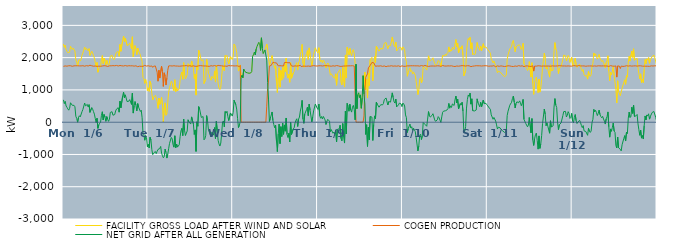
| Category | FACILITY GROSS LOAD AFTER WIND AND SOLAR | COGEN PRODUCTION | NET GRID AFTER ALL GENERATION |
|---|---|---|---|
|  Mon  1/6 | 2422 | 1730 | 692 |
|  Mon  1/6 | 2316 | 1742 | 574 |
|  Mon  1/6 | 2391 | 1743 | 648 |
|  Mon  1/6 | 2245 | 1744 | 501 |
|  Mon  1/6 | 2195 | 1736 | 459 |
|  Mon  1/6 | 2151 | 1741 | 410 |
|  Mon  1/6 | 2121 | 1749 | 372 |
|  Mon  1/6 | 2169 | 1739 | 430 |
|  Mon  1/6 | 2351 | 1749 | 602 |
|  Mon  1/6 | 2306 | 1733 | 573 |
|  Mon  1/6 | 2254 | 1732 | 522 |
|  Mon  1/6 | 2295 | 1752 | 543 |
|  Mon  1/6 | 2267 | 1746 | 521 |
|  Mon  1/6 | 2207 | 1730 | 477 |
|  Mon  1/6 | 1932 | 1748 | 184 |
|  Mon  1/6 | 1855 | 1738 | 117 |
|  Mon  1/6 | 1748 | 1748 | 0 |
|  Mon  1/6 | 1893 | 1750 | 143 |
|  Mon  1/6 | 1943 | 1744 | 199 |
|  Mon  1/6 | 1893 | 1729 | 164 |
|  Mon  1/6 | 1935 | 1744 | 191 |
|  Mon  1/6 | 2075 | 1749 | 326 |
|  Mon  1/6 | 2143 | 1750 | 393 |
|  Mon  1/6 | 2120 | 1742 | 378 |
|  Mon  1/6 | 2328 | 1735 | 593 |
|  Mon  1/6 | 2241 | 1733 | 508 |
|  Mon  1/6 | 2285 | 1752 | 533 |
|  Mon  1/6 | 2279 | 1730 | 549 |
|  Mon  1/6 | 2211 | 1741 | 470 |
|  Mon  1/6 | 2279 | 1734 | 545 |
|  Mon  1/6 | 2069 | 1765 | 304 |
|  Mon  1/6 | 2053 | 1743 | 310 |
|  Mon  1/6 | 2198 | 1748 | 450 |
|  Mon  1/6 | 2140 | 1737 | 403 |
|  Mon  1/6 | 2064 | 1735 | 329 |
|  Mon  1/6 | 1991 | 1741 | 250 |
|  Mon  1/6 | 1856 | 1740 | 116 |
|  Mon  1/6 | 1719 | 1727 | -8 |
|  Mon  1/6 | 1851 | 1730 | 121 |
|  Mon  1/6 | 1548 | 1739 | -191 |
|  Mon  1/6 | 1652 | 1736 | -84 |
|  Mon  1/6 | 1695 | 1728 | -33 |
|  Mon  1/6 | 1731 | 1732 | -1 |
|  Mon  1/6 | 1941 | 1729 | 212 |
|  Mon  1/6 | 2064 | 1741 | 323 |
|  Mon  1/6 | 1812 | 1745 | 67 |
|  Mon  1/6 | 1988 | 1750 | 238 |
|  Mon  1/6 | 1900 | 1738 | 162 |
|  Mon  1/6 | 1773 | 1746 | 27 |
|  Mon  1/6 | 1914 | 1742 | 172 |
|  Mon  1/6 | 1819 | 1726 | 93 |
|  Mon  1/6 | 1764 | 1738 | 26 |
|  Mon  1/6 | 1830 | 1746 | 84 |
|  Mon  1/6 | 2044 | 1743 | 301 |
|  Mon  1/6 | 2045 | 1747 | 298 |
|  Mon  1/6 | 2072 | 1747 | 325 |
|  Mon  1/6 | 1968 | 1752 | 216 |
|  Mon  1/6 | 1936 | 1747 | 189 |
|  Mon  1/6 | 1984 | 1748 | 236 |
|  Mon  1/6 | 2101 | 1753 | 348 |
|  Mon  1/6 | 2163 | 1758 | 405 |
|  Mon  1/6 | 2145 | 1749 | 396 |
|  Mon  1/6 | 2191 | 1741 | 450 |
|  Mon  1/6 | 2042 | 1732 | 310 |
|  Mon  1/6 | 2408 | 1757 | 651 |
|  Mon  1/6 | 2196 | 1752 | 444 |
|  Mon  1/6 | 2211 | 1747 | 464 |
|  Mon  1/6 | 2540 | 1730 | 810 |
|  Mon  1/6 | 2669 | 1741 | 928 |
|  Mon  1/6 | 2499 | 1744 | 755 |
|  Mon  1/6 | 2602 | 1755 | 847 |
|  Mon  1/6 | 2608 | 1742 | 866 |
|  Mon  1/6 | 2378 | 1739 | 639 |
|  Mon  1/6 | 2396 | 1747 | 649 |
|  Mon  1/6 | 2401 | 1750 | 651 |
|  Mon  1/6 | 2456 | 1756 | 700 |
|  Mon  1/6 | 2370 | 1746 | 624 |
|  Mon  1/6 | 2275 | 1725 | 550 |
|  Mon  1/6 | 2646 | 1747 | 899 |
|  Mon  1/6 | 2026 | 1744 | 282 |
|  Mon  1/6 | 2253 | 1737 | 516 |
|  Mon  1/6 | 2374 | 1735 | 639 |
|  Mon  1/6 | 2271 | 1747 | 524 |
|  Mon  1/6 | 2091 | 1741 | 350 |
|  Mon  1/6 | 2296 | 1720 | 576 |
|  Mon  1/6 | 2212 | 1746 | 466 |
|  Mon  1/6 | 2200 | 1735 | 465 |
|  Mon  1/6 | 2080 | 1748 | 332 |
|  Mon  1/6 | 2102 | 1731 | 371 |
|  Mon  1/6 | 1881 | 1742 | 139 |
|  Mon  1/6 | 1385 | 1730 | -345 |
|  Mon  1/6 | 1344 | 1733 | -389 |
|  Mon  1/6 | 1202 | 1761 | -559 |
|  Mon  1/6 | 1326 | 1740 | -414 |
|  Mon  1/6 | 1258 | 1738 | -480 |
|  Mon  1/6 | 975 | 1741 | -766 |
|  Tue  1/7 | 1065 | 1749 | -684 |
|  Tue  1/7 | 954 | 1753 | -799 |
|  Tue  1/7 | 1264 | 1732 | -468 |
|  Tue  1/7 | 1179 | 1730 | -551 |
|  Tue  1/7 | 890 | 1742 | -852 |
|  Tue  1/7 | 693 | 1698 | -1005 |
|  Tue  1/7 | 778 | 1734 | -956 |
|  Tue  1/7 | 778 | 1743 | -965 |
|  Tue  1/7 | 834 | 1742 | -908 |
|  Tue  1/7 | 741 | 1715 | -974 |
|  Tue  1/7 | 649 | 1549 | -900 |
|  Tue  1/7 | 427 | 1270 | -843 |
|  Tue  1/7 | 747 | 1609 | -862 |
|  Tue  1/7 | 551 | 1367 | -816 |
|  Tue  1/7 | 642 | 1394 | -752 |
|  Tue  1/7 | 772 | 1733 | -961 |
|  Tue  1/7 | 536 | 1570 | -1034 |
|  Tue  1/7 | 6 | 1109 | -1103 |
|  Tue  1/7 | 462 | 1530 | -1068 |
|  Tue  1/7 | 599 | 1434 | -835 |
|  Tue  1/7 | 213 | 1151 | -938 |
|  Tue  1/7 | 253 | 1365 | -1112 |
|  Tue  1/7 | 613 | 1607 | -994 |
|  Tue  1/7 | 920 | 1743 | -823 |
|  Tue  1/7 | 1075 | 1735 | -660 |
|  Tue  1/7 | 1096 | 1747 | -651 |
|  Tue  1/7 | 1268 | 1741 | -473 |
|  Tue  1/7 | 1223 | 1740 | -517 |
|  Tue  1/7 | 1045 | 1741 | -696 |
|  Tue  1/7 | 975 | 1749 | -774 |
|  Tue  1/7 | 1315 | 1736 | -421 |
|  Tue  1/7 | 946 | 1740 | -794 |
|  Tue  1/7 | 1066 | 1743 | -677 |
|  Tue  1/7 | 967 | 1739 | -772 |
|  Tue  1/7 | 997 | 1745 | -748 |
|  Tue  1/7 | 1035 | 1734 | -699 |
|  Tue  1/7 | 1299 | 1744 | -445 |
|  Tue  1/7 | 1476 | 1739 | -263 |
|  Tue  1/7 | 1554 | 1745 | -191 |
|  Tue  1/7 | 1330 | 1745 | -415 |
|  Tue  1/7 | 1844 | 1749 | 95 |
|  Tue  1/7 | 1493 | 1748 | -255 |
|  Tue  1/7 | 1341 | 1755 | -414 |
|  Tue  1/7 | 1319 | 1754 | -435 |
|  Tue  1/7 | 1468 | 1741 | -273 |
|  Tue  1/7 | 1812 | 1738 | 74 |
|  Tue  1/7 | 1752 | 1746 | 6 |
|  Tue  1/7 | 1784 | 1751 | 33 |
|  Tue  1/7 | 1705 | 1763 | -58 |
|  Tue  1/7 | 1898 | 1734 | 164 |
|  Tue  1/7 | 1892 | 1748 | 144 |
|  Tue  1/7 | 1691 | 1747 | -56 |
|  Tue  1/7 | 1353 | 1733 | -380 |
|  Tue  1/7 | 1494 | 1733 | -239 |
|  Tue  1/7 | 838 | 1744 | -906 |
|  Tue  1/7 | 1744 | 1732 | 12 |
|  Tue  1/7 | 1622 | 1748 | -126 |
|  Tue  1/7 | 2229 | 1747 | 482 |
|  Tue  1/7 | 2156 | 1744 | 412 |
|  Tue  1/7 | 2160 | 1753 | 407 |
|  Tue  1/7 | 1899 | 1752 | 147 |
|  Tue  1/7 | 1901 | 1746 | 155 |
|  Tue  1/7 | 1934 | 1760 | 174 |
|  Tue  1/7 | 1196 | 1742 | -546 |
|  Tue  1/7 | 1223 | 1736 | -513 |
|  Tue  1/7 | 1335 | 1742 | -407 |
|  Tue  1/7 | 1952 | 1748 | 204 |
|  Tue  1/7 | 1782 | 1735 | 47 |
|  Tue  1/7 | 1511 | 1740 | -229 |
|  Tue  1/7 | 1473 | 1730 | -257 |
|  Tue  1/7 | 1347 | 1733 | -386 |
|  Tue  1/7 | 1299 | 1750 | -451 |
|  Tue  1/7 | 1419 | 1721 | -302 |
|  Tue  1/7 | 1421 | 1739 | -318 |
|  Tue  1/7 | 1348 | 1750 | -402 |
|  Tue  1/7 | 1589 | 1755 | -166 |
|  Tue  1/7 | 1243 | 1749 | -506 |
|  Tue  1/7 | 1767 | 1735 | 32 |
|  Tue  1/7 | 1474 | 1737 | -263 |
|  Tue  1/7 | 1195 | 1759 | -564 |
|  Tue  1/7 | 1062 | 1735 | -673 |
|  Tue  1/7 | 1012 | 1751 | -739 |
|  Tue  1/7 | 1077 | 1723 | -646 |
|  Tue  1/7 | 1398 | 1746 | -348 |
|  Tue  1/7 | 1746 | 1740 | 6 |
|  Tue  1/7 | 1776 | 1737 | 39 |
|  Tue  1/7 | 1597 | 1743 | -146 |
|  Tue  1/7 | 2070 | 1738 | 332 |
|  Tue  1/7 | 2039 | 1756 | 283 |
|  Tue  1/7 | 2070 | 1732 | 338 |
|  Tue  1/7 | 1904 | 1729 | 175 |
|  Tue  1/7 | 1805 | 1755 | 50 |
|  Tue  1/7 | 1815 | 1744 | 71 |
|  Tue  1/7 | 2032 | 1747 | 285 |
|  Tue  1/7 | 2045 | 1758 | 287 |
|  Tue  1/7 | 1939 | 1750 | 189 |
|  Wed  1/8 | 2037 | 1737 | 300 |
|  Wed  1/8 | 2422 | 1742 | 680 |
|  Wed  1/8 | 2386 | 1726 | 660 |
|  Wed  1/8 | 2285 | 1745 | 540 |
|  Wed  1/8 | 2163 | 1757 | 406 |
|  Wed  1/8 | 1863 | 1745 | 118 |
|  Wed  1/8 | 1583 | 1748 | -165 |
|  Wed  1/8 | 1627 | 1722 | -95 |
|  Wed  1/8 | 1774 | 1758 | 16 |
|  Wed  1/8 | 1376 | 0 | 1376 |
|  Wed  1/8 | 1460 | 0 | 1460 |
|  Wed  1/8 | 1374 | 0 | 1374 |
|  Wed  1/8 | 1642 | 0 | 1642 |
|  Wed  1/8 | 1593 | 0 | 1593 |
|  Wed  1/8 | 1547 | 0 | 1547 |
|  Wed  1/8 | 1568 | 0 | 1568 |
|  Wed  1/8 | 1530 | 0 | 1530 |
|  Wed  1/8 | 1503 | 0 | 1503 |
|  Wed  1/8 | 1516 | 0 | 1516 |
|  Wed  1/8 | 1514 | 0 | 1514 |
|  Wed  1/8 | 1528 | 0 | 1528 |
|  Wed  1/8 | 1568 | 0 | 1568 |
|  Wed  1/8 | 2044 | 0 | 2044 |
|  Wed  1/8 | 2086 | 0 | 2086 |
|  Wed  1/8 | 2172 | 0 | 2172 |
|  Wed  1/8 | 2085 | 0 | 2085 |
|  Wed  1/8 | 2263 | 0 | 2263 |
|  Wed  1/8 | 2348 | 0 | 2348 |
|  Wed  1/8 | 2353 | 0 | 2353 |
|  Wed  1/8 | 2473 | 0 | 2473 |
|  Wed  1/8 | 2439 | 0 | 2439 |
|  Wed  1/8 | 2226 | 0 | 2226 |
|  Wed  1/8 | 2614 | 0 | 2614 |
|  Wed  1/8 | 2289 | 0 | 2289 |
|  Wed  1/8 | 2127 | 0 | 2127 |
|  Wed  1/8 | 2107 | 0 | 2107 |
|  Wed  1/8 | 2240 | 0 | 2240 |
|  Wed  1/8 | 2237 | 0 | 2237 |
|  Wed  1/8 | 2420 | 496 | 1924 |
|  Wed  1/8 | 2266 | 1035 | 1231 |
|  Wed  1/8 | 1995 | 1279 | 716 |
|  Wed  1/8 | 1761 | 1740 | 21 |
|  Wed  1/8 | 1867 | 1750 | 117 |
|  Wed  1/8 | 1866 | 1757 | 109 |
|  Wed  1/8 | 2063 | 1747 | 316 |
|  Wed  1/8 | 1907 | 1857 | 50 |
|  Wed  1/8 | 1768 | 1844 | -76 |
|  Wed  1/8 | 1668 | 1841 | -173 |
|  Wed  1/8 | 1752 | 1842 | -90 |
|  Wed  1/8 | 1254 | 1836 | -582 |
|  Wed  1/8 | 922 | 1834 | -912 |
|  Wed  1/8 | 1380 | 1746 | -366 |
|  Wed  1/8 | 1689 | 1749 | -60 |
|  Wed  1/8 | 1085 | 1750 | -665 |
|  Wed  1/8 | 1603 | 1742 | -139 |
|  Wed  1/8 | 1301 | 1745 | -444 |
|  Wed  1/8 | 1702 | 1732 | -30 |
|  Wed  1/8 | 1364 | 1741 | -377 |
|  Wed  1/8 | 1764 | 1849 | -85 |
|  Wed  1/8 | 1568 | 1847 | -279 |
|  Wed  1/8 | 1983 | 1853 | 130 |
|  Wed  1/8 | 1461 | 1841 | -380 |
|  Wed  1/8 | 1367 | 1839 | -472 |
|  Wed  1/8 | 1491 | 1836 | -345 |
|  Wed  1/8 | 1237 | 1847 | -610 |
|  Wed  1/8 | 1844 | 1849 | -5 |
|  Wed  1/8 | 1360 | 1741 | -381 |
|  Wed  1/8 | 1377 | 1749 | -372 |
|  Wed  1/8 | 1526 | 1735 | -209 |
|  Wed  1/8 | 1570 | 1745 | -175 |
|  Wed  1/8 | 1717 | 1744 | -27 |
|  Wed  1/8 | 1791 | 1732 | 59 |
|  Wed  1/8 | 1845 | 1739 | 106 |
|  Wed  1/8 | 1614 | 1748 | -134 |
|  Wed  1/8 | 1841 | 1747 | 94 |
|  Wed  1/8 | 1902 | 1743 | 159 |
|  Wed  1/8 | 2105 | 1760 | 345 |
|  Wed  1/8 | 2190 | 1724 | 466 |
|  Wed  1/8 | 2409 | 1733 | 676 |
|  Wed  1/8 | 1834 | 1737 | 97 |
|  Wed  1/8 | 1700 | 1736 | -36 |
|  Wed  1/8 | 1987 | 1736 | 251 |
|  Wed  1/8 | 1979 | 1724 | 255 |
|  Wed  1/8 | 2123 | 1733 | 390 |
|  Wed  1/8 | 2219 | 1756 | 463 |
|  Wed  1/8 | 1942 | 1740 | 202 |
|  Wed  1/8 | 2302 | 1743 | 559 |
|  Wed  1/8 | 2103 | 1731 | 372 |
|  Wed  1/8 | 2107 | 1736 | 371 |
|  Wed  1/8 | 1751 | 1742 | 9 |
|  Wed  1/8 | 1904 | 1741 | 163 |
|  Wed  1/8 | 2102 | 1753 | 349 |
|  Wed  1/8 | 2073 | 1740 | 333 |
|  Wed  1/8 | 2306 | 1744 | 562 |
|  Wed  1/8 | 2287 | 1742 | 545 |
|  Wed  1/8 | 2175 | 1739 | 436 |
|  Thu  1/9 | 2143 | 1749 | 394 |
|  Thu  1/9 | 2309 | 1748 | 561 |
|  Thu  1/9 | 1946 | 1752 | 194 |
|  Thu  1/9 | 1870 | 1749 | 121 |
|  Thu  1/9 | 1925 | 1749 | 176 |
|  Thu  1/9 | 1839 | 1741 | 98 |
|  Thu  1/9 | 1927 | 1749 | 178 |
|  Thu  1/9 | 1876 | 1750 | 126 |
|  Thu  1/9 | 1808 | 1739 | 69 |
|  Thu  1/9 | 1680 | 1751 | -71 |
|  Thu  1/9 | 1783 | 1758 | 25 |
|  Thu  1/9 | 1834 | 1746 | 88 |
|  Thu  1/9 | 1799 | 1733 | 66 |
|  Thu  1/9 | 1772 | 1741 | 31 |
|  Thu  1/9 | 1457 | 1750 | -293 |
|  Thu  1/9 | 1501 | 1734 | -233 |
|  Thu  1/9 | 1505 | 1744 | -239 |
|  Thu  1/9 | 1404 | 1747 | -343 |
|  Thu  1/9 | 1422 | 1728 | -306 |
|  Thu  1/9 | 1364 | 1737 | -373 |
|  Thu  1/9 | 1497 | 1738 | -241 |
|  Thu  1/9 | 1145 | 1754 | -609 |
|  Thu  1/9 | 1508 | 1729 | -221 |
|  Thu  1/9 | 1553 | 1745 | -192 |
|  Thu  1/9 | 1534 | 1742 | -208 |
|  Thu  1/9 | 1635 | 1729 | -94 |
|  Thu  1/9 | 1236 | 1741 | -505 |
|  Thu  1/9 | 1154 | 1731 | -577 |
|  Thu  1/9 | 1699 | 1741 | -42 |
|  Thu  1/9 | 1282 | 1740 | -458 |
|  Thu  1/9 | 1088 | 1735 | -647 |
|  Thu  1/9 | 2084 | 1741 | 343 |
|  Thu  1/9 | 1373 | 1739 | -366 |
|  Thu  1/9 | 2325 | 1744 | 581 |
|  Thu  1/9 | 2228 | 1741 | 487 |
|  Thu  1/9 | 2085 | 1746 | 339 |
|  Thu  1/9 | 2291 | 1735 | 556 |
|  Thu  1/9 | 2125 | 1746 | 379 |
|  Thu  1/9 | 2063 | 1751 | 312 |
|  Thu  1/9 | 2215 | 1750 | 465 |
|  Thu  1/9 | 2249 | 1728 | 521 |
|  Thu  1/9 | 2128 | 1739 | 389 |
|  Thu  1/9 | 1821 | 1749 | 72 |
|  Thu  1/9 | 1796 | 0 | 1796 |
|  Thu  1/9 | 418 | 0 | 418 |
|  Thu  1/9 | 846 | 0 | 846 |
|  Thu  1/9 | 911 | 0 | 911 |
|  Thu  1/9 | 764 | 0 | 764 |
|  Thu  1/9 | 845 | 0 | 845 |
|  Thu  1/9 | 431 | 0 | 431 |
|  Thu  1/9 | 746 | 0 | 746 |
|  Thu  1/9 | 1441 | 0 | 1441 |
|  Thu  1/9 | 1064 | 194 | 870 |
|  Thu  1/9 | 1550 | 987 | 563 |
|  Thu  1/9 | 1012 | 1393 | -381 |
|  Thu  1/9 | 1325 | 1403 | -78 |
|  Thu  1/9 | 748 | 1499 | -751 |
|  Thu  1/9 | 1525 | 1684 | -159 |
|  Thu  1/9 | 1134 | 1684 | -550 |
|  Thu  1/9 | 1935 | 1758 | 177 |
|  Thu  1/9 | 1919 | 1732 | 187 |
|  Thu  1/9 | 2009 | 1851 | 158 |
|  Thu  1/9 | 1283 | 1850 | -567 |
|  Thu  1/9 | 1773 | 1841 | -68 |
|  Thu  1/9 | 2032 | 1837 | 195 |
|  Thu  1/9 | 1840 | 1732 | 108 |
|  Thu  1/9 | 2355 | 1737 | 618 |
|  Thu  1/9 | 2299 | 1741 | 558 |
|  Thu  1/9 | 2278 | 1743 | 535 |
|  Thu  1/9 | 2202 | 1738 | 464 |
|  Thu  1/9 | 2239 | 1746 | 493 |
|  Thu  1/9 | 2290 | 1747 | 543 |
|  Thu  1/9 | 2277 | 1739 | 538 |
|  Thu  1/9 | 2265 | 1729 | 536 |
|  Thu  1/9 | 2328 | 1749 | 579 |
|  Thu  1/9 | 2443 | 1743 | 700 |
|  Thu  1/9 | 2457 | 1740 | 717 |
|  Thu  1/9 | 2470 | 1720 | 750 |
|  Thu  1/9 | 2485 | 1739 | 746 |
|  Thu  1/9 | 2272 | 1739 | 533 |
|  Thu  1/9 | 2368 | 1730 | 638 |
|  Thu  1/9 | 2366 | 1737 | 629 |
|  Thu  1/9 | 2368 | 1747 | 621 |
|  Thu  1/9 | 2349 | 1749 | 600 |
|  Thu  1/9 | 2640 | 1731 | 909 |
|  Thu  1/9 | 2500 | 1735 | 765 |
|  Thu  1/9 | 2383 | 1747 | 636 |
|  Thu  1/9 | 2335 | 1742 | 593 |
|  Thu  1/9 | 2483 | 1765 | 718 |
|  Thu  1/9 | 2211 | 1734 | 477 |
|  Thu  1/9 | 2247 | 1740 | 507 |
|  Thu  1/9 | 2283 | 1747 | 536 |
|  Thu  1/9 | 2323 | 1733 | 590 |
|  Thu  1/9 | 2316 | 1723 | 593 |
|  Thu  1/9 | 2309 | 1744 | 565 |
|  Thu  1/9 | 2228 | 1747 | 481 |
|  Fri  1/10 | 2334 | 1742 | 592 |
|  Fri  1/10 | 2291 | 1730 | 561 |
|  Fri  1/10 | 2239 | 1738 | 501 |
|  Fri  1/10 | 1957 | 1733 | 224 |
|  Fri  1/10 | 1884 | 1743 | 141 |
|  Fri  1/10 | 1424 | 1745 | -321 |
|  Fri  1/10 | 1537 | 1739 | -202 |
|  Fri  1/10 | 1530 | 1744 | -214 |
|  Fri  1/10 | 1685 | 1742 | -57 |
|  Fri  1/10 | 1567 | 1748 | -181 |
|  Fri  1/10 | 1600 | 1741 | -141 |
|  Fri  1/10 | 1491 | 1748 | -257 |
|  Fri  1/10 | 1557 | 1742 | -185 |
|  Fri  1/10 | 1544 | 1747 | -203 |
|  Fri  1/10 | 1453 | 1741 | -288 |
|  Fri  1/10 | 1274 | 1745 | -471 |
|  Fri  1/10 | 1273 | 1732 | -459 |
|  Fri  1/10 | 857 | 1746 | -889 |
|  Fri  1/10 | 999 | 1740 | -741 |
|  Fri  1/10 | 1330 | 1737 | -407 |
|  Fri  1/10 | 1379 | 1750 | -371 |
|  Fri  1/10 | 1216 | 1755 | -539 |
|  Fri  1/10 | 1317 | 1731 | -414 |
|  Fri  1/10 | 1729 | 1739 | -10 |
|  Fri  1/10 | 1732 | 1727 | 5 |
|  Fri  1/10 | 1690 | 1758 | -68 |
|  Fri  1/10 | 1714 | 1752 | -38 |
|  Fri  1/10 | 1613 | 1740 | -127 |
|  Fri  1/10 | 1849 | 1752 | 97 |
|  Fri  1/10 | 2056 | 1728 | 328 |
|  Fri  1/10 | 1928 | 1732 | 196 |
|  Fri  1/10 | 1897 | 1738 | 159 |
|  Fri  1/10 | 1902 | 1747 | 155 |
|  Fri  1/10 | 1952 | 1741 | 211 |
|  Fri  1/10 | 1995 | 1733 | 262 |
|  Fri  1/10 | 1973 | 1739 | 234 |
|  Fri  1/10 | 1816 | 1746 | 70 |
|  Fri  1/10 | 1766 | 1739 | 27 |
|  Fri  1/10 | 1744 | 1734 | 10 |
|  Fri  1/10 | 1821 | 1747 | 74 |
|  Fri  1/10 | 1911 | 1739 | 172 |
|  Fri  1/10 | 1879 | 1744 | 135 |
|  Fri  1/10 | 1842 | 1735 | 107 |
|  Fri  1/10 | 1720 | 1728 | -8 |
|  Fri  1/10 | 1902 | 1738 | 164 |
|  Fri  1/10 | 2065 | 1757 | 308 |
|  Fri  1/10 | 2082 | 1740 | 342 |
|  Fri  1/10 | 2053 | 1741 | 312 |
|  Fri  1/10 | 2101 | 1749 | 352 |
|  Fri  1/10 | 2065 | 1738 | 327 |
|  Fri  1/10 | 2128 | 1747 | 381 |
|  Fri  1/10 | 2160 | 1745 | 415 |
|  Fri  1/10 | 2332 | 1752 | 580 |
|  Fri  1/10 | 2176 | 1742 | 434 |
|  Fri  1/10 | 2250 | 1743 | 507 |
|  Fri  1/10 | 2204 | 1747 | 457 |
|  Fri  1/10 | 2318 | 1753 | 565 |
|  Fri  1/10 | 2293 | 1732 | 561 |
|  Fri  1/10 | 2257 | 1740 | 517 |
|  Fri  1/10 | 2421 | 1725 | 696 |
|  Fri  1/10 | 2561 | 1752 | 809 |
|  Fri  1/10 | 2336 | 1741 | 595 |
|  Fri  1/10 | 2443 | 1730 | 713 |
|  Fri  1/10 | 2145 | 1735 | 410 |
|  Fri  1/10 | 2138 | 1753 | 385 |
|  Fri  1/10 | 2320 | 1744 | 576 |
|  Fri  1/10 | 2272 | 1738 | 534 |
|  Fri  1/10 | 2370 | 1752 | 618 |
|  Fri  1/10 | 2081 | 1739 | 342 |
|  Fri  1/10 | 1433 | 1748 | -315 |
|  Fri  1/10 | 1449 | 1731 | -282 |
|  Fri  1/10 | 1602 | 1740 | -138 |
|  Fri  1/10 | 2184 | 1747 | 437 |
|  Fri  1/10 | 2457 | 1750 | 707 |
|  Fri  1/10 | 2595 | 1751 | 844 |
|  Fri  1/10 | 2546 | 1747 | 799 |
|  Fri  1/10 | 2632 | 1732 | 900 |
|  Fri  1/10 | 2280 | 1721 | 559 |
|  Fri  1/10 | 2461 | 1736 | 725 |
|  Fri  1/10 | 2092 | 1735 | 357 |
|  Fri  1/10 | 2125 | 1746 | 379 |
|  Fri  1/10 | 2090 | 1742 | 348 |
|  Fri  1/10 | 2122 | 1751 | 371 |
|  Fri  1/10 | 2128 | 1750 | 378 |
|  Fri  1/10 | 2469 | 1745 | 724 |
|  Fri  1/10 | 2348 | 1747 | 601 |
|  Fri  1/10 | 2318 | 1743 | 575 |
|  Fri  1/10 | 2223 | 1747 | 476 |
|  Fri  1/10 | 2356 | 1739 | 617 |
|  Fri  1/10 | 2212 | 1740 | 472 |
|  Fri  1/10 | 2228 | 1741 | 487 |
|  Fri  1/10 | 2431 | 1746 | 685 |
|  Fri  1/10 | 2313 | 1738 | 575 |
|  Fri  1/10 | 2307 | 1750 | 557 |
|  Fri  1/10 | 2330 | 1746 | 584 |
|  Fri  1/10 | 2289 | 1747 | 542 |
|  Sat  1/11 | 2249 | 1743 | 506 |
|  Sat  1/11 | 2240 | 1734 | 506 |
|  Sat  1/11 | 2176 | 1745 | 431 |
|  Sat  1/11 | 2138 | 1739 | 399 |
|  Sat  1/11 | 1963 | 1735 | 228 |
|  Sat  1/11 | 1992 | 1739 | 253 |
|  Sat  1/11 | 1839 | 1748 | 91 |
|  Sat  1/11 | 1898 | 1751 | 147 |
|  Sat  1/11 | 1869 | 1747 | 122 |
|  Sat  1/11 | 1753 | 1719 | 34 |
|  Sat  1/11 | 1657 | 1741 | -84 |
|  Sat  1/11 | 1532 | 1745 | -213 |
|  Sat  1/11 | 1576 | 1731 | -155 |
|  Sat  1/11 | 1550 | 1731 | -181 |
|  Sat  1/11 | 1557 | 1733 | -176 |
|  Sat  1/11 | 1526 | 1745 | -219 |
|  Sat  1/11 | 1518 | 1758 | -240 |
|  Sat  1/11 | 1464 | 1735 | -271 |
|  Sat  1/11 | 1467 | 1752 | -285 |
|  Sat  1/11 | 1408 | 1725 | -317 |
|  Sat  1/11 | 1395 | 1728 | -333 |
|  Sat  1/11 | 1455 | 1734 | -279 |
|  Sat  1/11 | 1948 | 1742 | 206 |
|  Sat  1/11 | 2089 | 1748 | 341 |
|  Sat  1/11 | 2099 | 1736 | 363 |
|  Sat  1/11 | 2271 | 1743 | 528 |
|  Sat  1/11 | 2275 | 1729 | 546 |
|  Sat  1/11 | 2348 | 1730 | 618 |
|  Sat  1/11 | 2488 | 1751 | 737 |
|  Sat  1/11 | 2535 | 1724 | 811 |
|  Sat  1/11 | 2363 | 1744 | 619 |
|  Sat  1/11 | 2181 | 1741 | 440 |
|  Sat  1/11 | 2332 | 1752 | 580 |
|  Sat  1/11 | 2362 | 1730 | 632 |
|  Sat  1/11 | 2381 | 1742 | 639 |
|  Sat  1/11 | 2353 | 1752 | 601 |
|  Sat  1/11 | 2394 | 1734 | 660 |
|  Sat  1/11 | 2344 | 1738 | 606 |
|  Sat  1/11 | 2252 | 1742 | 510 |
|  Sat  1/11 | 2329 | 1746 | 583 |
|  Sat  1/11 | 2443 | 1737 | 706 |
|  Sat  1/11 | 1810 | 1722 | 88 |
|  Sat  1/11 | 1817 | 1742 | 75 |
|  Sat  1/11 | 1702 | 1742 | -40 |
|  Sat  1/11 | 1670 | 1737 | -67 |
|  Sat  1/11 | 1599 | 1743 | -144 |
|  Sat  1/11 | 1648 | 1737 | -89 |
|  Sat  1/11 | 1876 | 1731 | 145 |
|  Sat  1/11 | 1873 | 1755 | 118 |
|  Sat  1/11 | 1398 | 1727 | -329 |
|  Sat  1/11 | 1843 | 1731 | 112 |
|  Sat  1/11 | 1200 | 1748 | -548 |
|  Sat  1/11 | 862 | 1583 | -721 |
|  Sat  1/11 | 1222 | 1739 | -517 |
|  Sat  1/11 | 1356 | 1743 | -387 |
|  Sat  1/11 | 1399 | 1736 | -337 |
|  Sat  1/11 | 1168 | 1737 | -569 |
|  Sat  1/11 | 913 | 1748 | -835 |
|  Sat  1/11 | 1333 | 1758 | -425 |
|  Sat  1/11 | 932 | 1744 | -812 |
|  Sat  1/11 | 1061 | 1738 | -677 |
|  Sat  1/11 | 1320 | 1736 | -416 |
|  Sat  1/11 | 1712 | 1758 | -46 |
|  Sat  1/11 | 1691 | 1741 | -50 |
|  Sat  1/11 | 2142 | 1734 | 408 |
|  Sat  1/11 | 1988 | 1738 | 250 |
|  Sat  1/11 | 1652 | 1761 | -109 |
|  Sat  1/11 | 1719 | 1739 | -20 |
|  Sat  1/11 | 1628 | 1753 | -125 |
|  Sat  1/11 | 1618 | 1739 | -121 |
|  Sat  1/11 | 1396 | 1738 | -342 |
|  Sat  1/11 | 1777 | 1733 | 44 |
|  Sat  1/11 | 1591 | 1741 | -150 |
|  Sat  1/11 | 1565 | 1745 | -180 |
|  Sat  1/11 | 1613 | 1724 | -111 |
|  Sat  1/11 | 2209 | 1740 | 469 |
|  Sat  1/11 | 2466 | 1735 | 731 |
|  Sat  1/11 | 2269 | 1740 | 529 |
|  Sat  1/11 | 2204 | 1747 | 457 |
|  Sat  1/11 | 1748 | 1743 | 5 |
|  Sat  1/11 | 1505 | 1736 | -231 |
|  Sat  1/11 | 1671 | 1752 | -81 |
|  Sat  1/11 | 1673 | 1756 | -83 |
|  Sat  1/11 | 1724 | 1745 | -21 |
|  Sat  1/11 | 1718 | 1744 | -26 |
|  Sat  1/11 | 1945 | 1741 | 204 |
|  Sat  1/11 | 2081 | 1752 | 329 |
|  Sat  1/11 | 2094 | 1742 | 352 |
|  Sat  1/11 | 2055 | 1721 | 334 |
|  Sat  1/11 | 1899 | 1738 | 161 |
|  Sat  1/11 | 1967 | 1753 | 214 |
|  Sat  1/11 | 2070 | 1744 | 326 |
|  Sat  1/11 | 2010 | 1740 | 270 |
|  Sat  1/11 | 1854 | 1738 | 116 |
|  Sat  1/11 | 1879 | 1731 | 148 |
|  Sat  1/11 | 2008 | 1736 | 272 |
|  Sun  1/12 | 1773 | 1733 | 40 |
|  Sun  1/12 | 1731 | 1752 | -21 |
|  Sun  1/12 | 1893 | 1742 | 151 |
|  Sun  1/12 | 1983 | 1747 | 236 |
|  Sun  1/12 | 1774 | 1728 | 46 |
|  Sun  1/12 | 1698 | 1739 | -41 |
|  Sun  1/12 | 1737 | 1730 | 7 |
|  Sun  1/12 | 1755 | 1754 | 1 |
|  Sun  1/12 | 1800 | 1745 | 55 |
|  Sun  1/12 | 1728 | 1742 | -14 |
|  Sun  1/12 | 1638 | 1742 | -104 |
|  Sun  1/12 | 1574 | 1743 | -169 |
|  Sun  1/12 | 1638 | 1742 | -104 |
|  Sun  1/12 | 1474 | 1743 | -269 |
|  Sun  1/12 | 1436 | 1727 | -291 |
|  Sun  1/12 | 1445 | 1733 | -288 |
|  Sun  1/12 | 1437 | 1734 | -297 |
|  Sun  1/12 | 1334 | 1741 | -407 |
|  Sun  1/12 | 1571 | 1761 | -190 |
|  Sun  1/12 | 1461 | 1742 | -281 |
|  Sun  1/12 | 1422 | 1739 | -317 |
|  Sun  1/12 | 1471 | 1743 | -272 |
|  Sun  1/12 | 1739 | 1747 | -8 |
|  Sun  1/12 | 1825 | 1737 | 88 |
|  Sun  1/12 | 2145 | 1749 | 396 |
|  Sun  1/12 | 2066 | 1743 | 323 |
|  Sun  1/12 | 2118 | 1751 | 367 |
|  Sun  1/12 | 2034 | 1736 | 298 |
|  Sun  1/12 | 1954 | 1750 | 204 |
|  Sun  1/12 | 2017 | 1747 | 270 |
|  Sun  1/12 | 2100 | 1727 | 373 |
|  Sun  1/12 | 1980 | 1744 | 236 |
|  Sun  1/12 | 1920 | 1747 | 173 |
|  Sun  1/12 | 1878 | 1742 | 136 |
|  Sun  1/12 | 1917 | 1737 | 180 |
|  Sun  1/12 | 1842 | 1744 | 98 |
|  Sun  1/12 | 1770 | 1738 | 32 |
|  Sun  1/12 | 1684 | 1742 | -58 |
|  Sun  1/12 | 1845 | 1742 | 103 |
|  Sun  1/12 | 1914 | 1741 | 173 |
|  Sun  1/12 | 2058 | 1740 | 318 |
|  Sun  1/12 | 1585 | 1728 | -143 |
|  Sun  1/12 | 1284 | 1748 | -464 |
|  Sun  1/12 | 1543 | 1752 | -209 |
|  Sun  1/12 | 1466 | 1749 | -283 |
|  Sun  1/12 | 1578 | 1738 | -160 |
|  Sun  1/12 | 1720 | 1747 | -27 |
|  Sun  1/12 | 1458 | 1734 | -276 |
|  Sun  1/12 | 1432 | 1749 | -317 |
|  Sun  1/12 | 1015 | 1742 | -727 |
|  Sun  1/12 | 598 | 1397 | -799 |
|  Sun  1/12 | 1282 | 1744 | -462 |
|  Sun  1/12 | 951 | 1745 | -794 |
|  Sun  1/12 | 966 | 1736 | -770 |
|  Sun  1/12 | 821 | 1662 | -841 |
|  Sun  1/12 | 849 | 1738 | -889 |
|  Sun  1/12 | 1049 | 1749 | -700 |
|  Sun  1/12 | 1047 | 1728 | -681 |
|  Sun  1/12 | 1240 | 1740 | -500 |
|  Sun  1/12 | 1317 | 1734 | -417 |
|  Sun  1/12 | 1172 | 1756 | -584 |
|  Sun  1/12 | 1442 | 1750 | -308 |
|  Sun  1/12 | 1394 | 1750 | -356 |
|  Sun  1/12 | 1864 | 1738 | 126 |
|  Sun  1/12 | 2042 | 1730 | 312 |
|  Sun  1/12 | 1893 | 1747 | 146 |
|  Sun  1/12 | 1918 | 1739 | 179 |
|  Sun  1/12 | 2201 | 1737 | 464 |
|  Sun  1/12 | 2009 | 1738 | 271 |
|  Sun  1/12 | 2274 | 1743 | 531 |
|  Sun  1/12 | 1918 | 1742 | 176 |
|  Sun  1/12 | 1952 | 1746 | 206 |
|  Sun  1/12 | 1950 | 1748 | 202 |
|  Sun  1/12 | 1976 | 1737 | 239 |
|  Sun  1/12 | 1684 | 1735 | -51 |
|  Sun  1/12 | 1511 | 1746 | -235 |
|  Sun  1/12 | 1343 | 1749 | -406 |
|  Sun  1/12 | 1500 | 1747 | -247 |
|  Sun  1/12 | 1231 | 1725 | -494 |
|  Sun  1/12 | 1323 | 1736 | -413 |
|  Sun  1/12 | 1224 | 1746 | -522 |
|  Sun  1/12 | 1628 | 1736 | -108 |
|  Sun  1/12 | 1940 | 1747 | 193 |
|  Sun  1/12 | 1805 | 1735 | 70 |
|  Sun  1/12 | 1964 | 1740 | 224 |
|  Sun  1/12 | 1924 | 1734 | 190 |
|  Sun  1/12 | 2002 | 1742 | 260 |
|  Sun  1/12 | 1824 | 1730 | 94 |
|  Sun  1/12 | 1935 | 1755 | 180 |
|  Sun  1/12 | 1928 | 1745 | 183 |
|  Sun  1/12 | 2036 | 1736 | 300 |
|  Sun  1/12 | 2011 | 1740 | 271 |
|  Sun  1/12 | 2078 | 1747 | 331 |
|  Sun  1/12 | 2098 | 1747 | 351 |
|  Sun  1/12 | 1895 | 1744 | 151 |
|  Sun  1/12 | 1760 | 1745 | 15 |